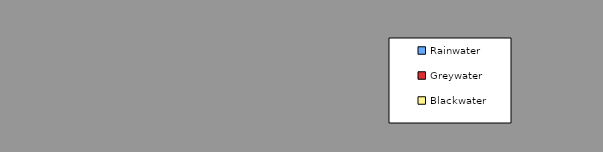
| Category | Series 0 | Series 1 |
|---|---|---|
| 0 | 0 |  |
| 1 | 0 |  |
| 2 | 0 |  |